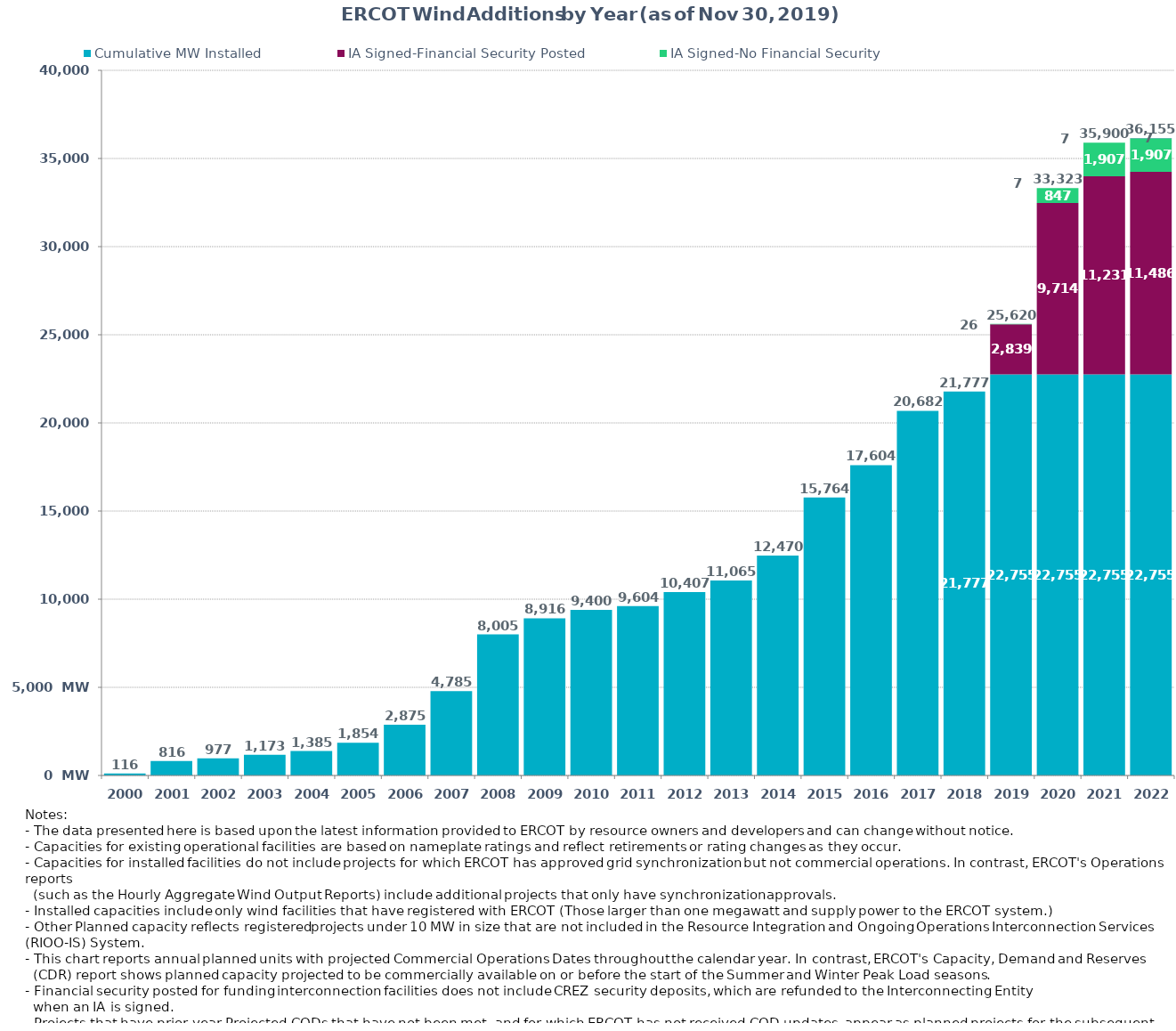
| Category | Cumulative MW Installed | IA Signed-Financial Security Posted  | IA Signed-No Financial Security  | Other Planned | Cumulative Installed and Planned |
|---|---|---|---|---|---|
| 2000.0 | 116 | 0 | 0 | 0 | 116 |
| 2001.0 | 816 | 0 | 0 | 0 | 816 |
| 2002.0 | 977 | 0 | 0 | 0 | 977 |
| 2003.0 | 1173 | 0 | 0 | 0 | 1173 |
| 2004.0 | 1385 | 0 | 0 | 0 | 1385 |
| 2005.0 | 1854 | 0 | 0 | 0 | 1854 |
| 2006.0 | 2875 | 0 | 0 | 0 | 2875 |
| 2007.0 | 4785 | 0 | 0 | 0 | 4785 |
| 2008.0 | 8005 | 0 | 0 | 0 | 8005 |
| 2009.0 | 8916 | 0 | 0 | 0 | 8916 |
| 2010.0 | 9400 | 0 | 0 | 0 | 9400 |
| 2011.0 | 9604 | 0 | 0 | 0 | 9604 |
| 2012.0 | 10407 | 0 | 0 | 0 | 10407 |
| 2013.0 | 11065 | 0 | 0 | 0 | 11065 |
| 2014.0 | 12470 | 0 | 0 | 0 | 12470 |
| 2015.0 | 15764 | 0 | 0 | 0 | 15764 |
| 2016.0 | 17604 | 0 | 0 | 0 | 17604 |
| 2017.0 | 20682 | 0 | 0 | 0 | 20682 |
| 2018.0 | 21777 | 0 | 0 | 0 | 21777 |
| 2019.0 | 22755.2 | 2839.24 | 25.7 | 0 | 25620.14 |
| 2020.0 | 22755.2 | 9713.87 | 847.22 | 7.2 | 33323.49 |
| 2021.0 | 22755.2 | 11231.02 | 1906.72 | 7.2 | 35900.14 |
| 2022.0 | 22755.2 | 11486.32 | 1906.72 | 7.2 | 36155.44 |